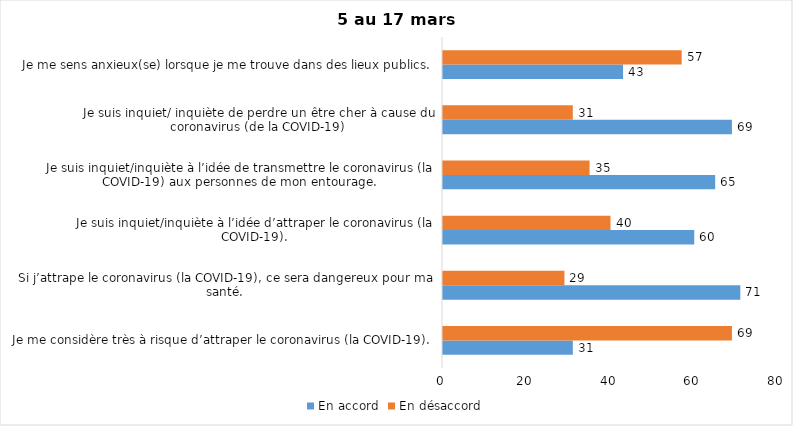
| Category | En accord | En désaccord |
|---|---|---|
| Je me considère très à risque d’attraper le coronavirus (la COVID-19). | 31 | 69 |
| Si j’attrape le coronavirus (la COVID-19), ce sera dangereux pour ma santé. | 71 | 29 |
| Je suis inquiet/inquiète à l’idée d’attraper le coronavirus (la COVID-19). | 60 | 40 |
| Je suis inquiet/inquiète à l’idée de transmettre le coronavirus (la COVID-19) aux personnes de mon entourage. | 65 | 35 |
| Je suis inquiet/ inquiète de perdre un être cher à cause du coronavirus (de la COVID-19) | 69 | 31 |
| Je me sens anxieux(se) lorsque je me trouve dans des lieux publics. | 43 | 57 |